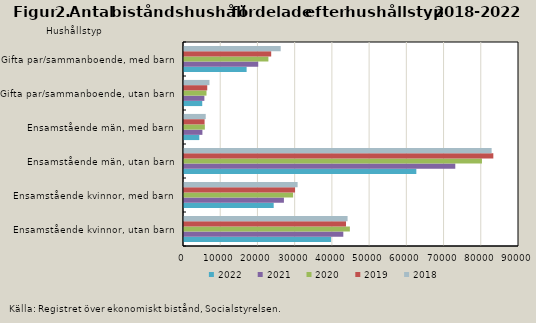
| Category | 2022 | 2021 | 2020 | 2019 | 2018 |
|---|---|---|---|---|---|
| Ensamstående kvinnor, utan barn | 39513 | 42798 | 44563 | 43526 | 43947 |
| Ensamstående kvinnor, med barn | 24096 | 26843 | 29319 | 29830 | 30527 |
| Ensamstående män, utan barn | 62417 | 72883 | 80047 | 83103 | 82650 |
| Ensamstående män, med barn | 4107 | 4946 | 5601 | 5532 | 5836 |
| Gifta par/sammanboende, utan barn | 4902 | 5474 | 6045 | 6244 | 6840 |
| Gifta par/sammanboende, med barn | 16825 | 19942 | 22674 | 23425 | 25978 |